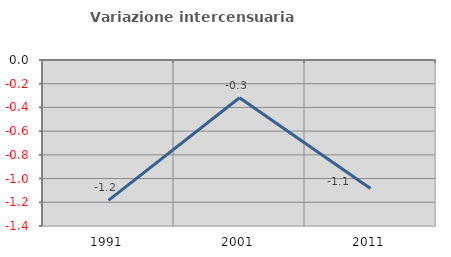
| Category | Variazione intercensuaria annua |
|---|---|
| 1991.0 | -1.184 |
| 2001.0 | -0.318 |
| 2011.0 | -1.084 |